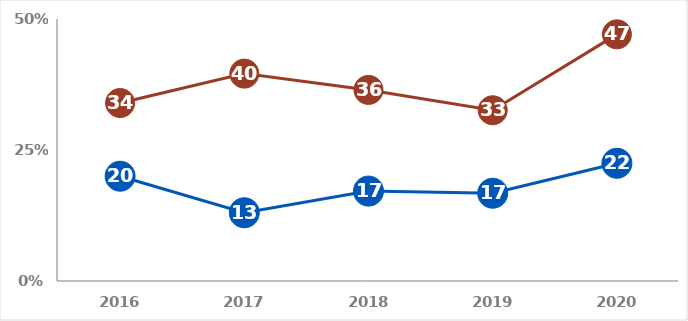
| Category | 8b SSL - percent (analytic study) | 10 SSL - percent (samples) |
|---|---|---|
| 2016.0 | 0.34 | 0.2 |
| 2017.0 | 0.396 | 0.13 |
| 2018.0 | 0.365 | 0.172 |
| 2019.0 | 0.326 | 0.168 |
| 2020.0 | 0.471 | 0.225 |